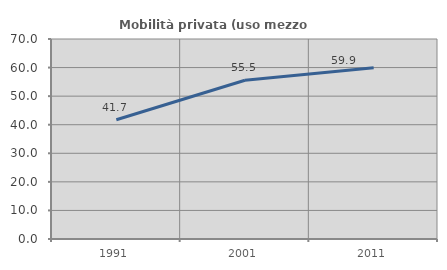
| Category | Mobilità privata (uso mezzo privato) |
|---|---|
| 1991.0 | 41.725 |
| 2001.0 | 55.549 |
| 2011.0 | 59.91 |